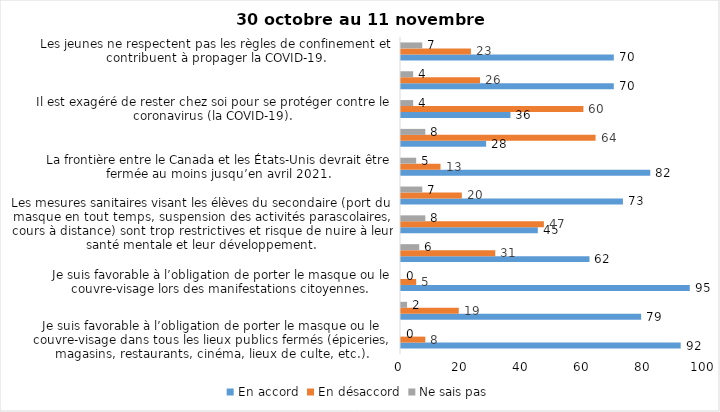
| Category | En accord | En désaccord | Ne sais pas |
|---|---|---|---|
| Je suis favorable à l’obligation de porter le masque ou le couvre-visage dans tous les lieux publics fermés (épiceries, magasins, restaurants, cinéma, lieux de culte, etc.). | 92 | 8 | 0 |
| C’est une bonne chose que les policiers puissent donner facilement des contraventions aux gens qui ne respectent pas les mesures pour prévenir le coronavirus (la COVID-19). | 79 | 19 | 2 |
| Je suis favorable à l’obligation de porter le masque ou le couvre-visage lors des manifestations citoyennes. | 95 | 5 | 0 |
| C’est une bonne chose d’arrêter les activités sportives de groupe (ex. hockey, soccer, yoga, etc.) et de fermer les centres d’entraînement (gyms) dans les zones rouges. | 62 | 31 | 6 |
| Les mesures sanitaires visant les élèves du secondaire (port du masque en tout temps, suspension des activités parascolaires, cours à distance) sont trop restrictives et risque de nuire à leur santé mentale et leur développement. | 45 | 47 | 8 |
| Je suis favorable à l’obligation de porter le masque ou le couvre-visage en tout temps pour les élèves au secondaire. | 73 | 20 | 7 |
| La frontière entre le Canada et les États-Unis devrait être fermée au moins jusqu’en avril 2021. | 82 | 13 | 5 |
| Le gouvernement et les médias exagèrent par rapport au coronavirus (la COVID-19). | 28 | 64 | 8 |
| Il est exagéré de rester chez soi pour se protéger contre le coronavirus (la COVID-19). | 36 | 60 | 4 |
| J’ai peur que le système de santé soit débordé par les cas de COVID-19 suite au «déconfinement». | 70 | 26 | 4 |
| Les jeunes ne respectent pas les règles de confinement et contribuent à propager la COVID-19. | 70 | 23 | 7 |